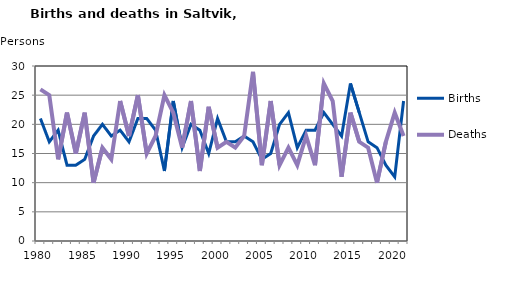
| Category | Births | Deaths |
|---|---|---|
| 1980.0 | 21 | 26 |
| 1981.0 | 17 | 25 |
| 1982.0 | 19 | 14 |
| 1983.0 | 13 | 22 |
| 1984.0 | 13 | 15 |
| 1985.0 | 14 | 22 |
| 1986.0 | 18 | 10 |
| 1987.0 | 20 | 16 |
| 1988.0 | 18 | 14 |
| 1989.0 | 19 | 24 |
| 1990.0 | 17 | 18 |
| 1991.0 | 21 | 25 |
| 1992.0 | 21 | 15 |
| 1993.0 | 19 | 18 |
| 1994.0 | 12 | 25 |
| 1995.0 | 24 | 22 |
| 1996.0 | 16 | 16 |
| 1997.0 | 20 | 24 |
| 1998.0 | 19 | 12 |
| 1999.0 | 15 | 23 |
| 2000.0 | 21 | 16 |
| 2001.0 | 17 | 17 |
| 2002.0 | 17 | 16 |
| 2003.0 | 18 | 18 |
| 2004.0 | 17 | 29 |
| 2005.0 | 14 | 13 |
| 2006.0 | 15 | 24 |
| 2007.0 | 20 | 13 |
| 2008.0 | 22 | 16 |
| 2009.0 | 16 | 13 |
| 2010.0 | 19 | 18 |
| 2011.0 | 19 | 13 |
| 2012.0 | 22 | 27 |
| 2013.0 | 20 | 24 |
| 2014.0 | 18 | 11 |
| 2015.0 | 27 | 22 |
| 2016.0 | 22 | 17 |
| 2017.0 | 17 | 16 |
| 2018.0 | 16 | 10 |
| 2019.0 | 13 | 17 |
| 2020.0 | 11 | 22 |
| 2021.0 | 24 | 18 |